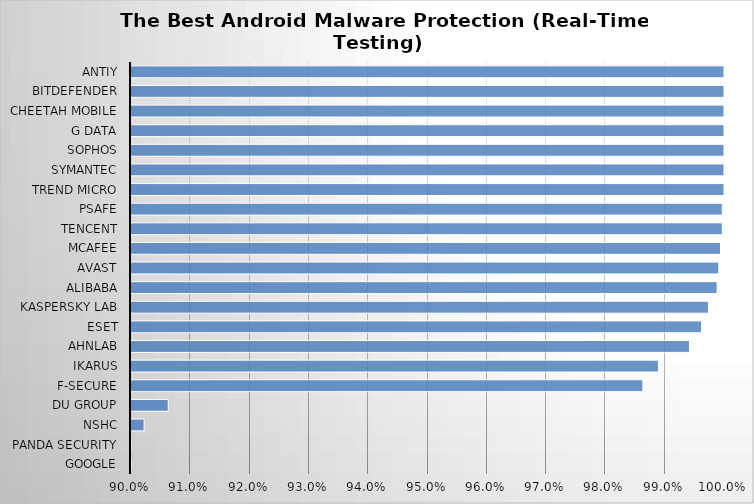
| Category | Series 0 |
|---|---|
| Google | 0.485 |
| Panda Security | 0.659 |
| NSHC | 0.902 |
| DU Group | 0.906 |
| F-Secure | 0.986 |
| Ikarus | 0.989 |
| AhnLab | 0.994 |
| ESET | 0.996 |
| Kaspersky Lab | 0.997 |
| Alibaba | 0.999 |
| Avast | 0.999 |
| McAfee | 0.999 |
| Tencent | 1 |
| PSafe | 1 |
| Trend Micro | 1 |
| Symantec | 1 |
| Sophos | 1 |
| G Data | 1 |
| Cheetah Mobile | 1 |
| Bitdefender | 1 |
| Antiy | 1 |